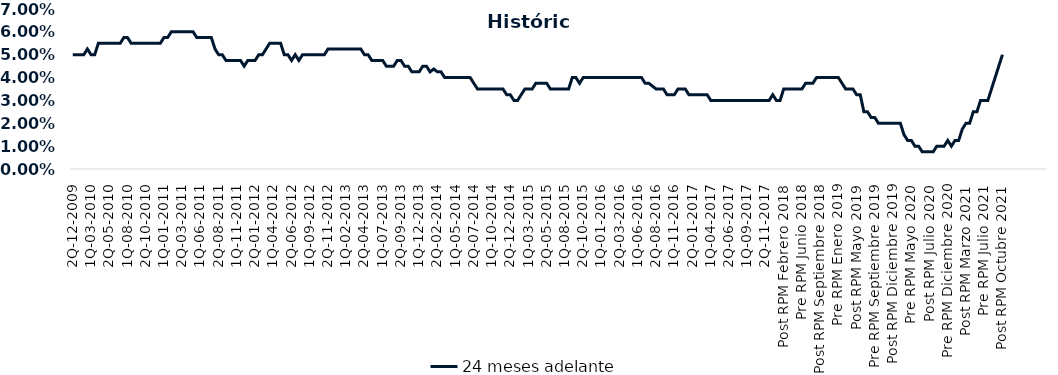
| Category | 24 meses adelante  |
|---|---|
| 2Q-12-2009 | 0.05 |
| 1Q-01-2010 | 0.05 |
| 2Q-01-2010 | 0.05 |
| 1Q-02-2010 | 0.05 |
| 2Q-02-2010 | 0.052 |
| 1Q-03-2010 | 0.05 |
| 2Q-03-2010 | 0.05 |
| 1Q-04-2010 | 0.055 |
| 2Q-04-2010 | 0.055 |
| 1Q-05-2010 | 0.055 |
| 2Q-05-2010 | 0.055 |
| 1Q-06-2010 | 0.055 |
| 2Q-06-2010 | 0.055 |
| 1Q-07-2010 | 0.055 |
| 2Q-07-2010 | 0.058 |
| 1Q-08-2010 | 0.058 |
| 2Q-08-2010 | 0.055 |
| 1Q-09-2010 | 0.055 |
| 2Q-09-2010 | 0.055 |
| 1Q-10-2010 | 0.055 |
| 2Q-10-2010 | 0.055 |
| 1Q-11-2010 | 0.055 |
| 2Q-11-2010 | 0.055 |
| 1Q-12-2010 | 0.055 |
| 2Q-12-2010 | 0.055 |
| 1Q-01-2011 | 0.058 |
| 2Q-01-2011 | 0.058 |
| 1Q-02-2011 | 0.06 |
| 2Q-02-2011 | 0.06 |
| 1Q-03-2011 | 0.06 |
| 2Q-03-2011 | 0.06 |
| 1Q-04-2011 | 0.06 |
| 2Q-04-2011 | 0.06 |
| 1Q-05-2011 | 0.06 |
| 2Q-05-2011 | 0.058 |
| 1Q-06-2011 | 0.058 |
| 2Q-06-2011 | 0.058 |
| 1Q-07-2011 | 0.058 |
| 2Q-07-2011 | 0.058 |
| 1Q-08-2011 | 0.052 |
| 2Q-08-2011 | 0.05 |
| 1Q-09-2011 | 0.05 |
| 2Q-09-2011 | 0.048 |
| 1Q-10-2011 | 0.048 |
| 2Q-10-2011 | 0.048 |
| 1Q-11-2011 | 0.048 |
| 2Q-11-2011 | 0.048 |
| 1Q-12-2011 | 0.045 |
| 2Q-12-2011 | 0.048 |
| 1Q-01-2012 | 0.048 |
| 2Q-01-2012 | 0.048 |
| 1Q-02-2012 | 0.05 |
| 2Q-02-2012 | 0.05 |
| 1Q-03-2012 | 0.052 |
| 2Q-03-2012 | 0.055 |
| 1Q-04-2012 | 0.055 |
| 2Q-04-2012 | 0.055 |
| 1Q-05-2012 | 0.055 |
| 2Q-05-2012 | 0.05 |
| 1Q-06-2012 | 0.05 |
| 2Q-06-2012 | 0.048 |
| 1Q-07-2012 | 0.05 |
| 2Q-07-2012 | 0.048 |
| 1Q-08-2012 | 0.05 |
| 2Q-08-2012 | 0.05 |
| 1Q-09-2012 | 0.05 |
| 2Q-09-2012 | 0.05 |
| 1Q-10-2012 | 0.05 |
| 2Q-10-2012 | 0.05 |
| 1Q-11-2012 | 0.05 |
| 2Q-11-2012 | 0.052 |
| 1Q-12-2012 | 0.052 |
| 2Q-12-2012 | 0.052 |
| 1Q-01-2013 | 0.052 |
| 2Q-01-2013 | 0.052 |
| 1Q-02-2013 | 0.052 |
| 2Q-02-2013 | 0.052 |
| 1Q-03-2013 | 0.052 |
| 2Q-03-2013 | 0.052 |
| 1Q-04-2013 | 0.052 |
| 2Q-04-2013 | 0.05 |
| 1Q-05-2013 | 0.05 |
| 2Q-05-2013 | 0.048 |
| 1Q-06-2013 | 0.048 |
| 2Q-06-2013 | 0.048 |
| 1Q-07-2013 | 0.048 |
| 2Q-07-2013 | 0.045 |
| 1Q-08-2013 | 0.045 |
| 2Q-08-2013 | 0.045 |
| 1Q-09-2013 | 0.048 |
| 2Q-09-2013 | 0.048 |
| 1Q-10-2013 | 0.045 |
| 2Q-10-2013 | 0.045 |
| 1Q-11-2013 | 0.042 |
| 2Q-11-2013 | 0.042 |
| 1Q-12-2013 | 0.042 |
| 2Q-12-2013 | 0.045 |
| 1Q-01-2014 | 0.045 |
| 2Q-01-2014 | 0.042 |
| 1Q-02-2014 | 0.044 |
| 2Q-02-2014 | 0.042 |
| 1Q-03-2014 | 0.042 |
| 2Q-03-2014 | 0.04 |
| 1Q-04-2014 | 0.04 |
| 2Q-04-2014 | 0.04 |
| 1Q-05-2014 | 0.04 |
| 2Q-05-2014 | 0.04 |
| 1Q-06-2014 | 0.04 |
| 2Q-06-2014 | 0.04 |
| 1Q-07-2014 | 0.04 |
| 2Q-07-2014 | 0.038 |
| 1Q-08-2014 | 0.035 |
| 2Q-08-2014 | 0.035 |
| 1Q-09-2014 | 0.035 |
| 2Q-09-2014 | 0.035 |
| 1Q-10-2014 | 0.035 |
| 2Q-10-2014 | 0.035 |
| 1Q-11-2014 | 0.035 |
| 2Q-11-2014 | 0.035 |
| 1Q-12-2014 | 0.032 |
| 2Q-12-2014 | 0.032 |
| 1Q-01-2015 | 0.03 |
| 2Q-01-2015 | 0.03 |
| 1Q-02-2015 | 0.032 |
| 2Q-02-2015 | 0.035 |
| 1Q-03-2015 | 0.035 |
| 2Q-03-2015 | 0.035 |
| 1Q-04-2015 | 0.038 |
| 2Q-04-2015 | 0.038 |
| 1Q-05-2015 | 0.038 |
| 2Q-05-2015 | 0.038 |
| 1Q-06-2015 | 0.035 |
| 2Q-06-2015 | 0.035 |
| 1Q-07-2015 | 0.035 |
| 2Q-07-2015 | 0.035 |
| 1Q-08-2015 | 0.035 |
| 2Q-08-2015 | 0.035 |
| 1Q-09-2015 | 0.04 |
| 2Q-09-2015 | 0.04 |
| 1Q-10-2015 | 0.038 |
| 2Q-10-2015 | 0.04 |
| 1Q-11-2015 | 0.04 |
| 2Q-11-2015 | 0.04 |
| 1Q-12-2015 | 0.04 |
| 2Q-12-2015 | 0.04 |
| 1Q-01-2016 | 0.04 |
| 2Q-01-2016 | 0.04 |
| 1Q-02-2016 | 0.04 |
| 2Q-02-2016 | 0.04 |
| 1Q-03-2016 | 0.04 |
| 2Q-03-2016 | 0.04 |
| 1Q-04-2016 | 0.04 |
| 2Q-04-2016 | 0.04 |
| 1Q-05-2016 | 0.04 |
| 2Q-05-2016 | 0.04 |
| 1Q-06-2016 | 0.04 |
| 2Q-06-2016 | 0.04 |
| 1Q-07-2016 | 0.038 |
| 2Q-07-2016 | 0.038 |
| 1Q-08-2016 | 0.036 |
| 2Q-08-2016 | 0.035 |
| 1Q-09-2016 | 0.035 |
| 2Q-09-2016 | 0.035 |
| 1Q-10-2016 | 0.032 |
| 2Q-10-2016 | 0.032 |
| 1Q-11-2016 | 0.032 |
| 2Q-11-2016 | 0.035 |
| 1Q-12-2016 | 0.035 |
| 2Q-12-2016 | 0.035 |
| 1Q-01-2017 | 0.032 |
| 2Q-01-2017 | 0.032 |
| 1Q-02-2017 | 0.032 |
| 2Q-02-2017 | 0.032 |
| 1Q-03-2017 | 0.032 |
| 2Q-03-2017 | 0.032 |
| 1Q-04-2017 | 0.03 |
| 2Q-04-2017 | 0.03 |
| 1Q-05-2017 | 0.03 |
| 2Q-05-2017 | 0.03 |
| 1Q-06-2017 | 0.03 |
| 2Q-06-2017 | 0.03 |
| 1Q-07-2017 | 0.03 |
| 2Q-07-2017 | 0.03 |
| 1Q-08-2017 | 0.03 |
| 2Q-08-2017 | 0.03 |
| 1Q-09-2017 | 0.03 |
| 2Q-09-2017 | 0.03 |
| 1Q-10-2017 | 0.03 |
| 2Q-10-2017 | 0.03 |
| 1Q-11-2017 | 0.03 |
| 2Q-11-2017 | 0.03 |
| 1Q-12-2017 | 0.03 |
| 2Q-12-2017 | 0.032 |
| 1Q-01-2018 | 0.03 |
| 2Q-01-2018 | 0.03 |
| Post RPM Febrero 2018 | 0.035 |
| Pre RPM Marzo 2018 | 0.035 |
| Post RPM Marzo 2018 | 0.035 |
| Pre RPM Mayo 2018 | 0.035 |
| Post RPM Mayo 2018 | 0.035 |
| Pre RPM Junio 2018 | 0.035 |
| Post RPM Junio 2018 | 0.038 |
| Pre RPM Julio 2018 | 0.038 |
| Post RPM Julio 2018 | 0.038 |
| Pre RPM Septiembre 2018 | 0.04 |
| Post RPM Septiembre 2018 | 0.04 |
| Pre RPM Octubre 2018 | 0.04 |
| Post RPM Octubre 2018 | 0.04 |
| Pre RPM Diciembre 2018 | 0.04 |
| Post RPM Diciembre 2018 | 0.04 |
| Pre RPM Enero 2019 | 0.04 |
| Post RPM Enero 2019 | 0.038 |
| Pre RPM Marzo 2019 | 0.035 |
| Post RPM Marzo 2019 | 0.035 |
| Pre RPM Mayo 2019 | 0.035 |
| Post RPM Mayo 2019 | 0.032 |
| Pre RPM Junio 2019 | 0.032 |
| Post RPM Junio 2019 | 0.025 |
| Pre RPM Julio 2019 | 0.025 |
| Post RPM Julio 2019 | 0.022 |
| Pre RPM Septiembre 2019 | 0.022 |
| Post RPM Septiembre 2019 | 0.02 |
| Pre RPM Octubre 2019 | 0.02 |
| Post RPM Octubre 2019 | 0.02 |
| Pre RPM Diciembre 2019 | 0.02 |
| Post RPM Diciembre 2019 | 0.02 |
| Pre RPM Enero 2020 | 0.02 |
| Post RPM Enero 2020 | 0.02 |
| Pre RPM Marzo 2020 | 0.015 |
| Post RPM Marzo 2020 | 0.012 |
| Pre RPM Mayo 2020 | 0.012 |
| Post RPM Mayo 2020 | 0.01 |
| Pre RPM Junio 2020 | 0.01 |
| Post RPM Junio 2020 | 0.008 |
| Pre RPM Julio 2020 | 0.008 |
| Post RPM Julio 2020 | 0.008 |
| Pre RPM Septiembre 2020 | 0.008 |
| Post RPM Septiembre 2020 | 0.01 |
| Pre RPM Octubre 2020 | 0.01 |
| Post RPM Octubre 2020 | 0.01 |
| Pre RPM Diciembre 2020 | 0.012 |
| Post RPM Diciembre 2020 | 0.01 |
| Pre RPM Enero 2021 | 0.012 |
| Post RPM Enero 2021 | 0.012 |
| Pre RPM Marzo 2021 | 0.018 |
| Post RPM Marzo 2021 | 0.02 |
| Pre RPM Mayo 2021 | 0.02 |
| Post RPM Mayo 2021 | 0.025 |
| Pre RPM Junio 2021 | 0.025 |
| Post RPM Junio 2021 | 0.03 |
| Pre RPM Julio 2021 | 0.03 |
| Post RPM Julio 2021 | 0.03 |
| Pre RPM Agosto 2021 | 0.035 |
| Post RPM Agosto 2021 | 0.04 |
| Pre RPM Octubre 2021 | 0.045 |
| Post RPM Octubre 2021 | 0.05 |